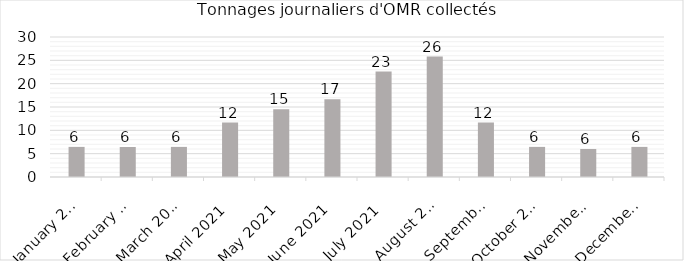
| Category | Tonnage journalier d'OMR |
|---|---|
| 2021-01-01 | 6.452 |
| 2021-02-01 | 6.429 |
| 2021-03-01 | 6.452 |
| 2021-04-01 | 11.667 |
| 2021-05-01 | 14.516 |
| 2021-06-01 | 16.667 |
| 2021-07-01 | 22.581 |
| 2021-08-01 | 25.806 |
| 2021-09-01 | 11.667 |
| 2021-10-01 | 6.452 |
| 2021-11-01 | 6 |
| 2021-12-01 | 6.452 |